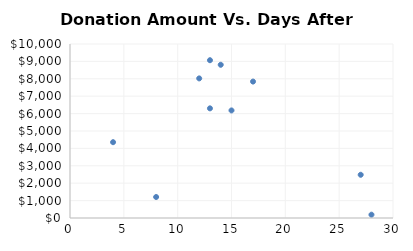
| Category | Days After Registration |
|---|---|
| 13.0 | 6302 |
| 8.0 | 1207 |
| 14.0 | 8806 |
| 27.0 | 2484 |
| 4.0 | 4357 |
| 15.0 | 6182 |
| 13.0 | 9068 |
| 28.0 | 190 |
| 17.0 | 7841 |
| 12.0 | 8023 |